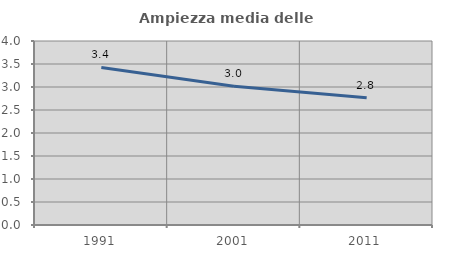
| Category | Ampiezza media delle famiglie |
|---|---|
| 1991.0 | 3.425 |
| 2001.0 | 3.015 |
| 2011.0 | 2.769 |